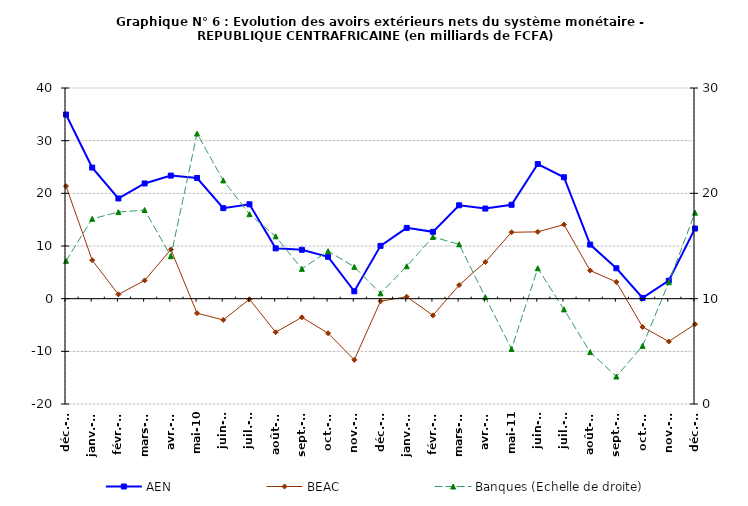
| Category | AEN | BEAC |
|---|---|---|
| 2009-12-04 | 34958 | 21365 |
| 2010-01-04 | 24888 | 7306 |
| 2010-02-04 | 19028 | 809 |
| 2010-03-04 | 21874 | 3459 |
| 2010-04-04 | 23367 | 9335 |
| 2010-05-04 | 22916 | -2758 |
| 2010-06-04 | 17187 | -4041 |
| 2010-07-04 | 17915 | -106 |
| 2010-08-04 | 9552 | -6363 |
| 2010-09-04 | 9283 | -3546 |
| 2010-10-04 | 7949 | -6564 |
| 2010-11-04 | 1401 | -11620 |
| 2010-12-04 | 10029 | -480 |
| 2011-01-01 | 13440 | 361 |
| 2011-02-01 | 12688 | -3175 |
| 2011-03-01 | 17734 | 2574 |
| 2011-04-01 | 17111 | 6968 |
| 2011-05-01 | 17827 | 12604 |
| 2011-06-01 | 25572 | 12686 |
| 2011-07-01 | 23053 | 14072 |
| 2011-08-01 | 10268 | 5343 |
| 2011-09-01 | 5772 | 3162 |
| 2011-10-01 | 150 | -5370 |
| 2011-11-01 | 3422 | -8134 |
| 2011-12-01 | 13316 | -4849 |